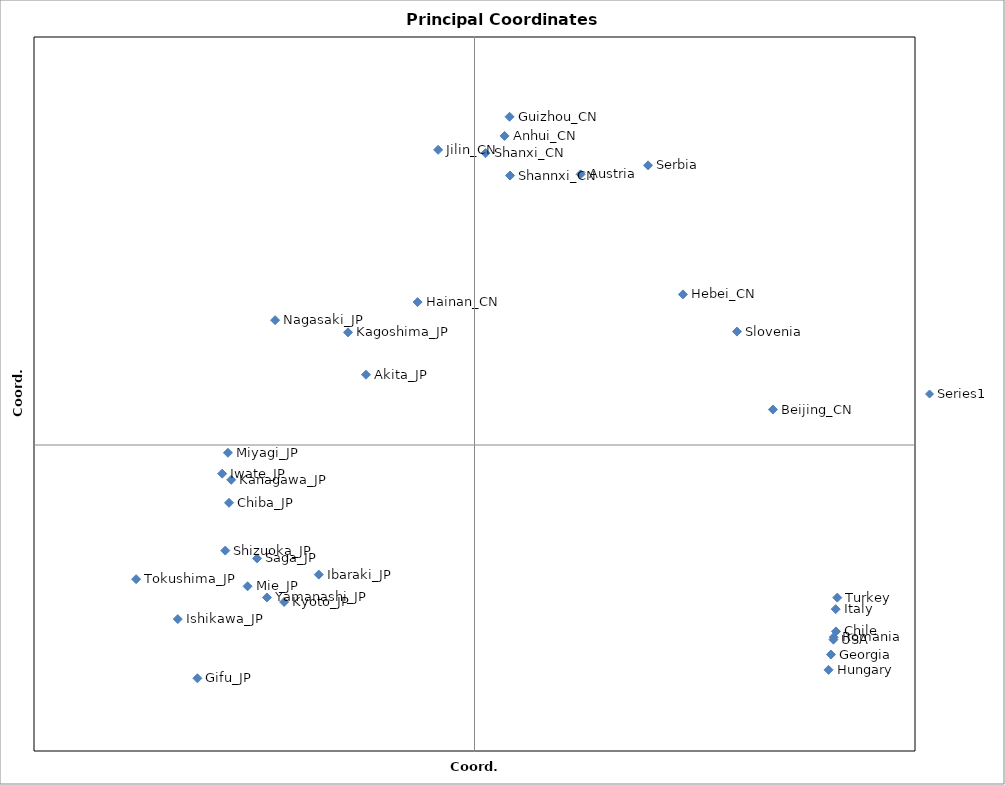
| Category | Series 0 |
|---|---|
| 0.07227151512942831 | 0.133 |
| 0.24614861653835654 | -0.091 |
| 0.02047881146459119 | 0.152 |
| 0.2032291329062602 | 0.017 |
| 0.023876543510758623 | 0.161 |
| -0.03876120002793812 | 0.07 |
| 0.1419692185565465 | 0.074 |
| -0.024765761647041837 | 0.145 |
| 0.02422245297143837 | 0.132 |
| 0.007494216982760321 | 0.143 |
| 0.2446642723330637 | -0.094 |
| 0.11820888735223632 | 0.137 |
| 0.178767814389978 | 0.056 |
| 0.24707048726767453 | -0.075 |
| 0.24442568869271697 | -0.095 |
| 0.24273728191093788 | -0.103 |
| 0.24112681311342596 | -0.11 |
| 0.24597452722265067 | -0.08 |
| -0.07389976033716127 | 0.034 |
| -0.16719532181944066 | -0.028 |
| -0.1887032664827593 | -0.114 |
| -0.1060532681680107 | -0.064 |
| -0.2020730882071991 | -0.085 |
| -0.17184454312877281 | -0.014 |
| -0.08614975302657987 | 0.055 |
| -0.16569823169092468 | -0.017 |
| -0.12965564004588453 | -0.077 |
| -0.15455586739473004 | -0.069 |
| -0.16792949851396036 | -0.004 |
| -0.13577653787915842 | 0.061 |
| -0.14805838168293586 | -0.056 |
| -0.16972633890476363 | -0.052 |
| -0.23045151573982298 | -0.066 |
| -0.14136830564822836 | -0.075 |